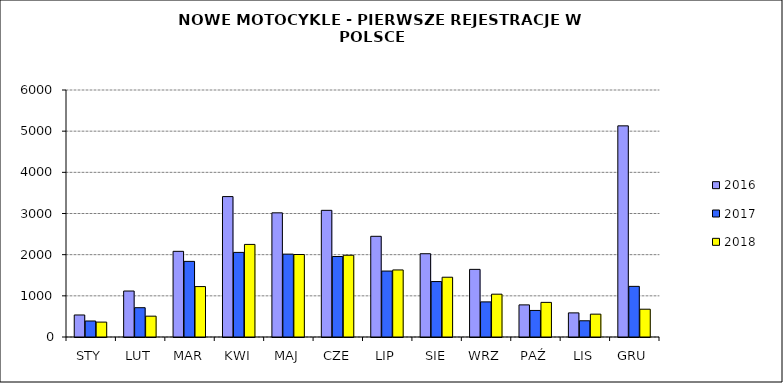
| Category | 2016 | 2017 | 2018 |
|---|---|---|---|
|  STY  | 535 | 389 | 362 |
|  LUT  | 1117 | 712 | 506 |
| MAR | 2081 | 1837 | 1225 |
| KWI | 3411 | 2055 | 2249 |
| MAJ | 3016 | 2013 | 2004 |
| CZE | 3077 | 1955 | 1986 |
| LIP | 2446 | 1602 | 1629 |
| SIE | 2023 | 1347 | 1452 |
| WRZ | 1643 | 853 | 1040 |
| PAŹ | 780 | 645 | 841 |
| LIS | 586 | 394 | 555 |
| GRU | 5129 | 1230 | 675 |